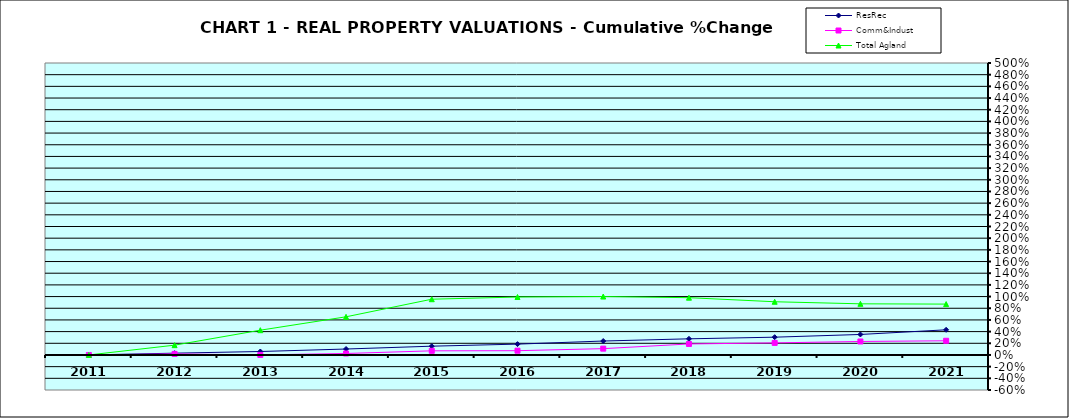
| Category | ResRec | Comm&Indust | Total Agland |
|---|---|---|---|
| 2011.0 | 0 | 0 | 0 |
| 2012.0 | 0.031 | 0.018 | 0.168 |
| 2013.0 | 0.059 | 0.001 | 0.424 |
| 2014.0 | 0.102 | 0.025 | 0.654 |
| 2015.0 | 0.15 | 0.071 | 0.955 |
| 2016.0 | 0.186 | 0.073 | 0.993 |
| 2017.0 | 0.239 | 0.108 | 1 |
| 2018.0 | 0.276 | 0.189 | 0.981 |
| 2019.0 | 0.305 | 0.207 | 0.911 |
| 2020.0 | 0.351 | 0.231 | 0.876 |
| 2021.0 | 0.431 | 0.243 | 0.871 |